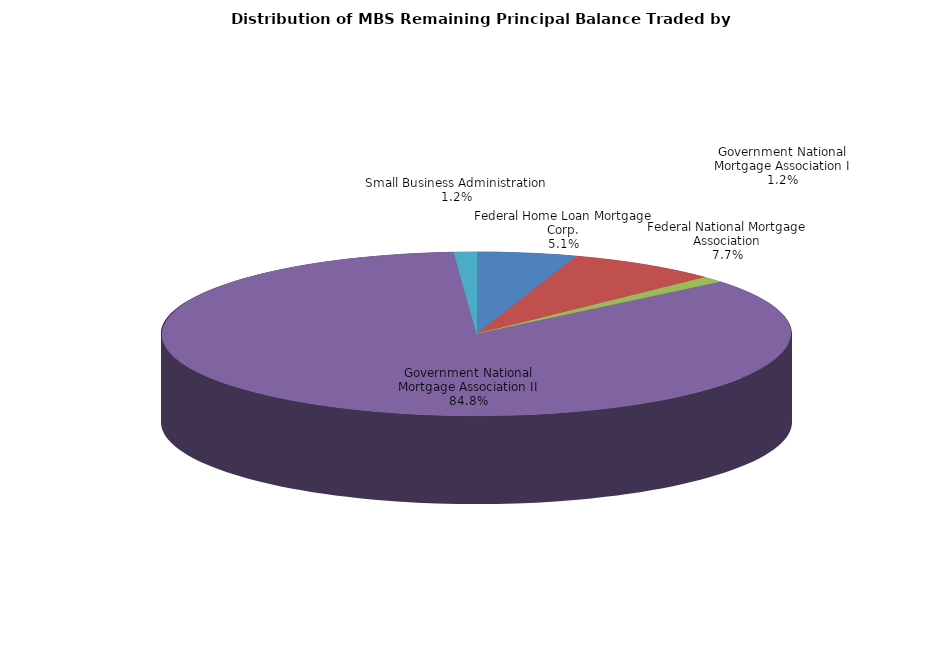
| Category | Series 0 |
|---|---|
| Federal Home Loan Mortgage Corp. | 294859056.341 |
| Federal National Mortgage Association | 445848620.69 |
| Government National Mortgage Association I | 68944251.157 |
| Government National Mortgage Association II | 4889348652.167 |
| Small Business Administration | 66821225.948 |